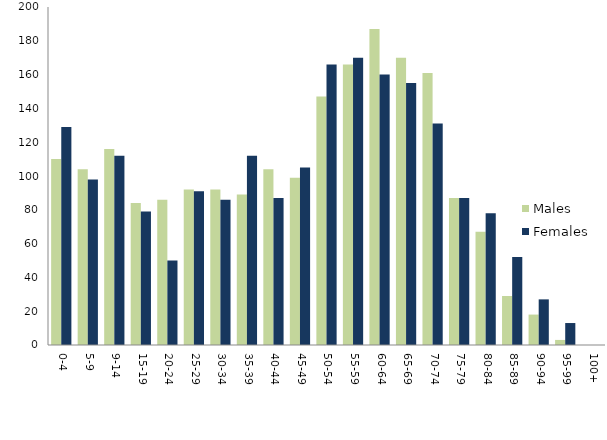
| Category | Males | Females |
|---|---|---|
| 0-4 | 110 | 129 |
| 5-9 | 104 | 98 |
| 9-14 | 116 | 112 |
| 15-19 | 84 | 79 |
| 20-24 | 86 | 50 |
| 25-29 | 92 | 91 |
| 30-34 | 92 | 86 |
| 35-39 | 89 | 112 |
| 40-44 | 104 | 87 |
| 45-49 | 99 | 105 |
| 50-54 | 147 | 166 |
| 55-59 | 166 | 170 |
| 60-64 | 187 | 160 |
| 65-69 | 170 | 155 |
| 70-74 | 161 | 131 |
| 75-79 | 87 | 87 |
| 80-84 | 67 | 78 |
| 85-89 | 29 | 52 |
| 90-94 | 18 | 27 |
| 95-99 | 3 | 13 |
| 100+ | 0 | 0 |